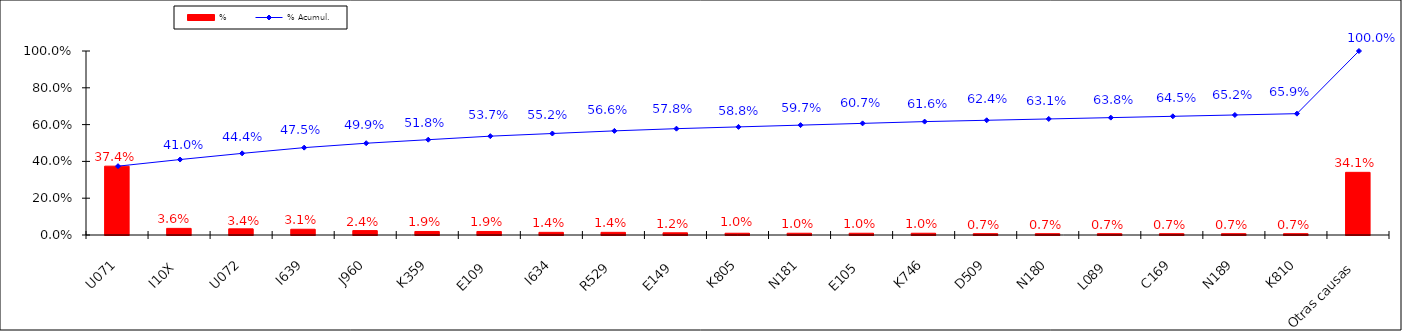
| Category | % |
|---|---|
| U071 | 0.374 |
| I10X | 0.036 |
| U072 | 0.034 |
| I639 | 0.031 |
| J960 | 0.024 |
| K359 | 0.019 |
| E109 | 0.019 |
| I634 | 0.014 |
| R529 | 0.014 |
| E149 | 0.012 |
| K805 | 0.01 |
| N181 | 0.01 |
| E105 | 0.01 |
| K746 | 0.01 |
| D509 | 0.007 |
| N180 | 0.007 |
| L089 | 0.007 |
| C169 | 0.007 |
| N189 | 0.007 |
| K810 | 0.007 |
| Otras causas | 0.341 |